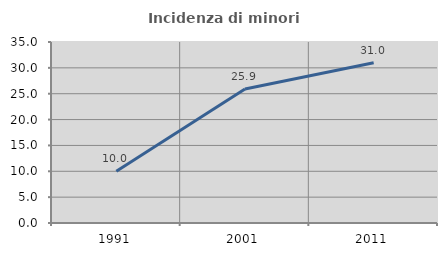
| Category | Incidenza di minori stranieri |
|---|---|
| 1991.0 | 10 |
| 2001.0 | 25.899 |
| 2011.0 | 30.97 |